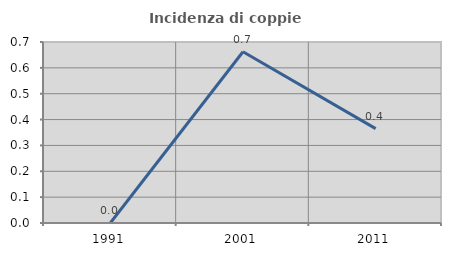
| Category | Incidenza di coppie miste |
|---|---|
| 1991.0 | 0 |
| 2001.0 | 0.662 |
| 2011.0 | 0.365 |